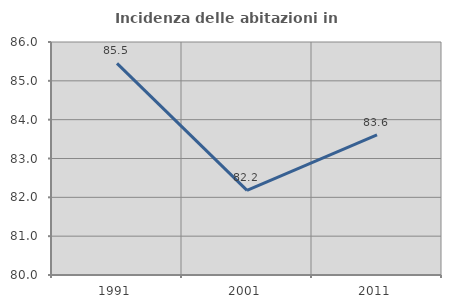
| Category | Incidenza delle abitazioni in proprietà  |
|---|---|
| 1991.0 | 85.45 |
| 2001.0 | 82.178 |
| 2011.0 | 83.607 |